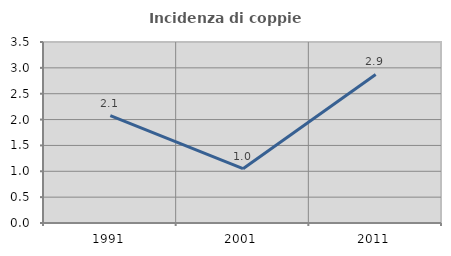
| Category | Incidenza di coppie miste |
|---|---|
| 1991.0 | 2.078 |
| 2001.0 | 1.05 |
| 2011.0 | 2.872 |